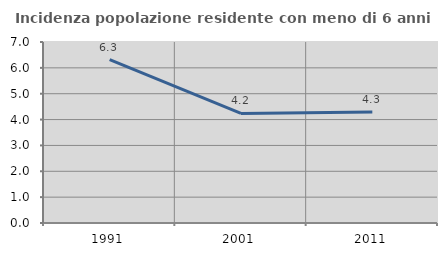
| Category | Incidenza popolazione residente con meno di 6 anni |
|---|---|
| 1991.0 | 6.315 |
| 2001.0 | 4.237 |
| 2011.0 | 4.296 |